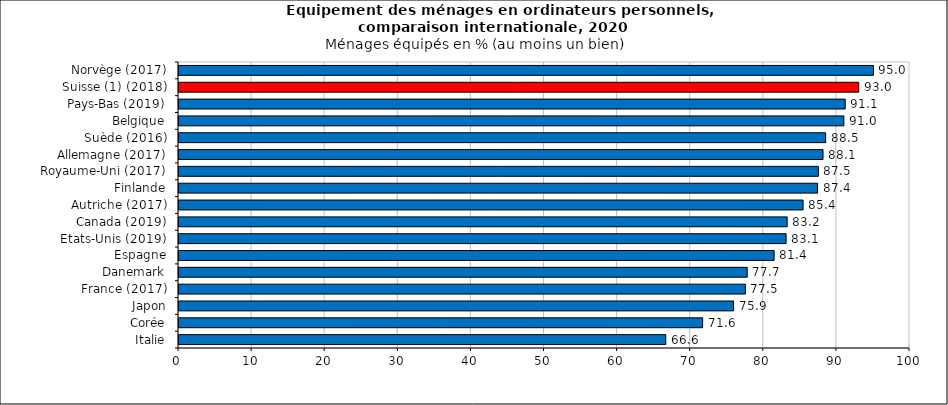
| Category | Italie |
|---|---|
| Italie | 66.588 |
| Corée | 71.633 |
| Japon | 75.863 |
| France (2017) | 77.483 |
| Danemark | 77.732 |
| Espagne | 81.415 |
| Etats-Unis (2019) | 83.054 |
| Canada (2019) | 83.199 |
| Autriche (2017) | 85.373 |
| Finlande | 87.355 |
| Royaume-Uni (2017) | 87.464 |
| Allemagne (2017) | 88.102 |
| Suède (2016) | 88.46 |
| Belgique | 90.953 |
|  Pays-Bas (2019) | 91.139 |
| Suisse (1) (2018) | 92.988 |
| Norvège (2017) | 95 |